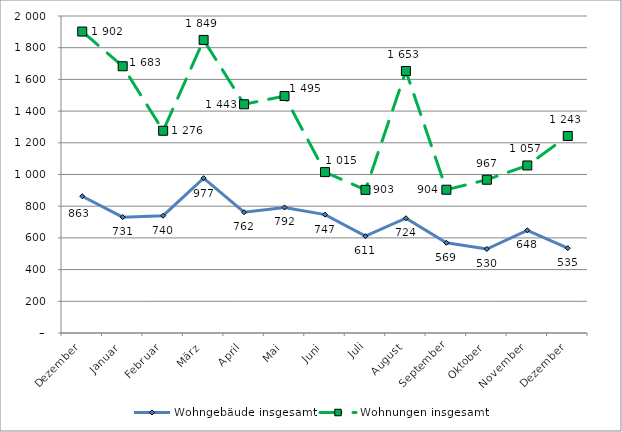
| Category | Wohngebäude insgesamt | Wohnungen insgesamt |
|---|---|---|
| Dezember | 863 | 1902 |
| Januar | 731 | 1683 |
| Februar | 740 | 1276 |
| März | 977 | 1849 |
| April | 762 | 1443 |
| Mai | 792 | 1495 |
| Juni | 747 | 1015 |
| Juli | 611 | 903 |
| August | 724 | 1653 |
| September | 569 | 904 |
| Oktober | 530 | 967 |
| November | 648 | 1057 |
| Dezember | 535 | 1243 |